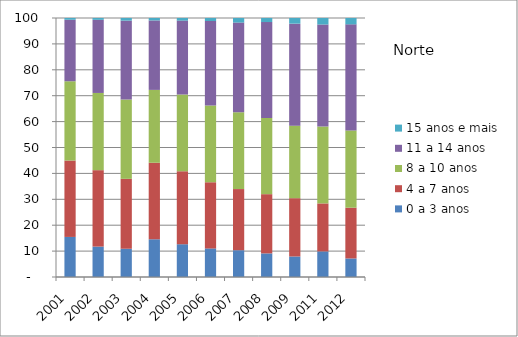
| Category | 0 a 3 anos | 4 a 7 anos | 8 a 10 anos | 11 a 14 anos | 15 anos e mais |
|---|---|---|---|---|---|
| 2001.0 | 15.47 | 29.5 | 30.61 | 23.74 | 0.68 |
| 2002.0 | 11.74 | 29.51 | 29.81 | 28.23 | 0.72 |
| 2003.0 | 10.91 | 26.99 | 30.63 | 30.46 | 1.01 |
| 2004.0 | 14.57 | 29.54 | 28.13 | 26.82 | 0.95 |
| 2005.0 | 12.66 | 28.19 | 29.65 | 28.49 | 1.02 |
| 2006.0 | 11.04 | 25.58 | 29.64 | 32.58 | 1.16 |
| 2007.0 | 10.34 | 23.61 | 29.63 | 34.65 | 1.76 |
| 2008.0 | 9.11 | 22.87 | 29.43 | 37.02 | 1.56 |
| 2009.0 | 7.92 | 22.51 | 28 | 39.38 | 2.19 |
| 2011.0 | 9.88 | 18.53 | 29.69 | 39.38 | 2.52 |
| 2012.0 | 7.16 | 19.6 | 29.83 | 40.95 | 2.45 |